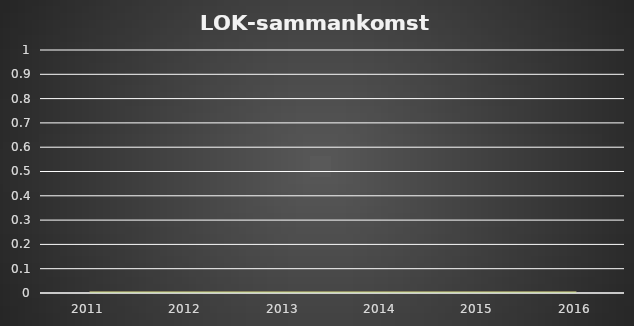
| Category | Vår | Höst | Totalt |
|---|---|---|---|
| 2011.0 | 0 | 0 | 0 |
| 2012.0 | 0 | 0 | 0 |
| 2013.0 | 0 | 0 | 0 |
| 2014.0 | 0 | 0 | 0 |
| 2015.0 | 0 | 0 | 0 |
| 2016.0 | 0 | 0 | 0 |